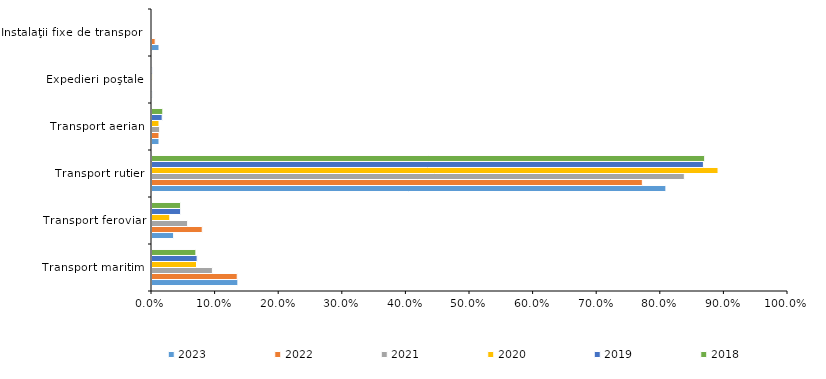
| Category | 2023 | 2022 | 2021 | 2020 | 2019 | 2018 |
|---|---|---|---|---|---|---|
| Transport maritim | 13.5 | 13.4 | 9.5 | 7 | 7.1 | 6.9 |
| Transport feroviar | 3.4 | 7.9 | 5.6 | 2.8 | 4.5 | 4.5 |
| Transport rutier | 80.8 | 77.1 | 83.7 | 89 | 86.7 | 86.9 |
| Transport aerian | 1.1 | 1.1 | 1.2 | 1.1 | 1.6 | 1.7 |
| Expedieri poştale | 0.1 | 0 | 0 | 0.1 | 0.1 | 0 |
| Instalaţii fixe de transport | 1.1 | 0.5 | 0 | 0 | 0 | 0 |